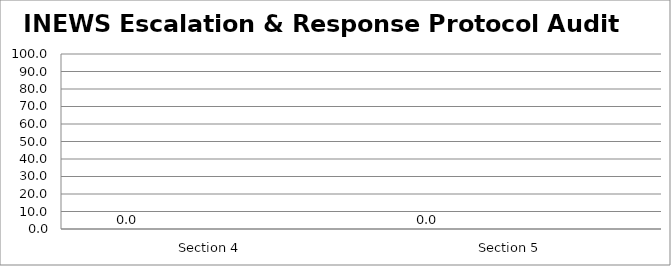
| Category | Series 0 | Series 1 | Series 2 | Series 3 |
|---|---|---|---|---|
| Section 4 | 0 |  |  |  |
| Section 5 | 0 |  |  |  |